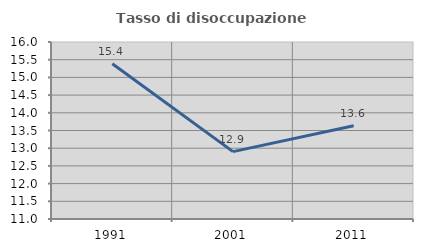
| Category | Tasso di disoccupazione giovanile  |
|---|---|
| 1991.0 | 15.385 |
| 2001.0 | 12.903 |
| 2011.0 | 13.636 |